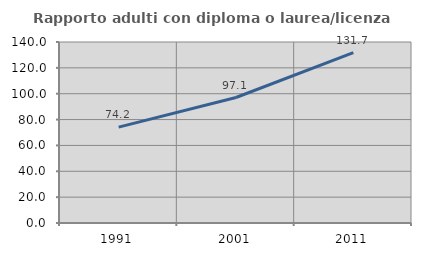
| Category | Rapporto adulti con diploma o laurea/licenza media  |
|---|---|
| 1991.0 | 74.183 |
| 2001.0 | 97.052 |
| 2011.0 | 131.739 |